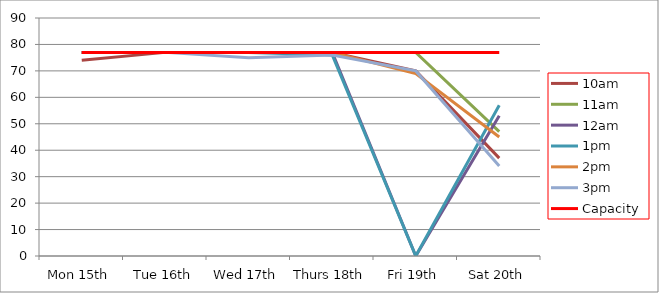
| Category | 9am | 10am | 11am | 12am | 1pm | 2pm | 3pm | 4pm | 5pm | Capacity |
|---|---|---|---|---|---|---|---|---|---|---|
| Mon 15th |  | 74 | 77 | 77 | 77 | 77 | 77 |  |  | 77 |
| Tue 16th |  | 77 | 77 | 77 | 77 | 77 | 77 |  |  | 77 |
| Wed 17th |  | 77 | 77 | 77 | 77 | 77 | 75 |  |  | 77 |
| Thurs 18th |  | 77 | 77 | 77 | 76 | 77 | 76 |  |  | 77 |
| Fri 19th |  | 70 | 77 | 0 | 0 | 69 | 70 |  |  | 77 |
| Sat 20th |  | 37 | 47 | 53 | 57 | 45 | 34 |  |  | 77 |